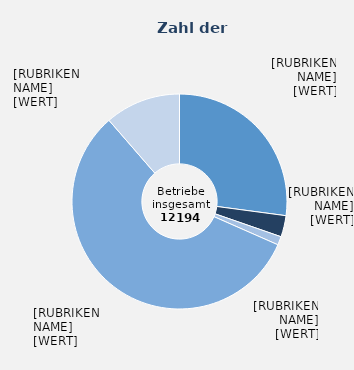
| Category | Series 0 |
|---|---|
| Ackerbaubetriebe | 27.112 |
| Gartenbaubetriebe | 3.206 |
| Dauerkulturbetriebe | 1.279 |
| Futterbaubetriebe | 57.02 |
| Veredlungs- und Verbundbetriebe | 11.383 |